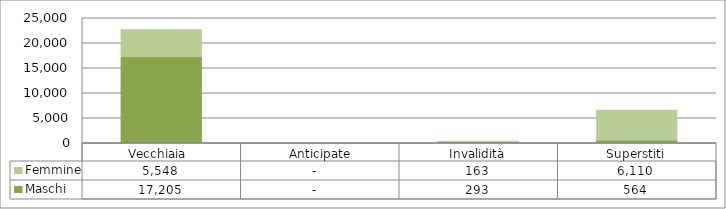
| Category | Maschi | Femmine |
|---|---|---|
| Vecchiaia  | 17205 | 5548 |
|  Anticipate | 0 | 0 |
| Invalidità | 293 | 163 |
| Superstiti | 564 | 6110 |